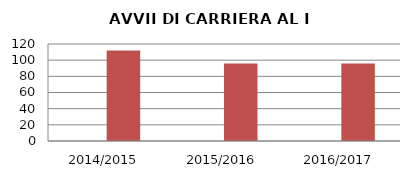
| Category | ANNO | NUMERO |
|---|---|---|
| 2014/2015 | 0 | 112 |
| 2015/2016 | 0 | 96 |
| 2016/2017 | 0 | 96 |